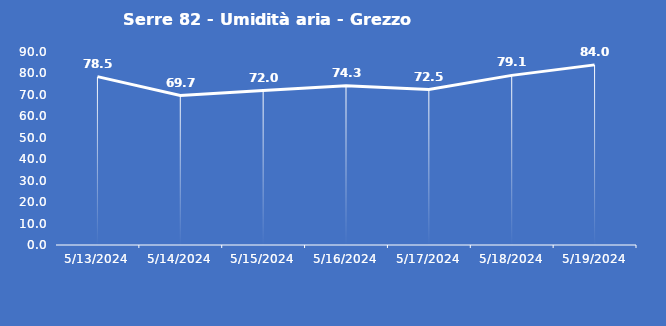
| Category | Serre 82 - Umidità aria - Grezzo (%) |
|---|---|
| 5/13/24 | 78.5 |
| 5/14/24 | 69.7 |
| 5/15/24 | 72 |
| 5/16/24 | 74.3 |
| 5/17/24 | 72.5 |
| 5/18/24 | 79.1 |
| 5/19/24 | 84 |